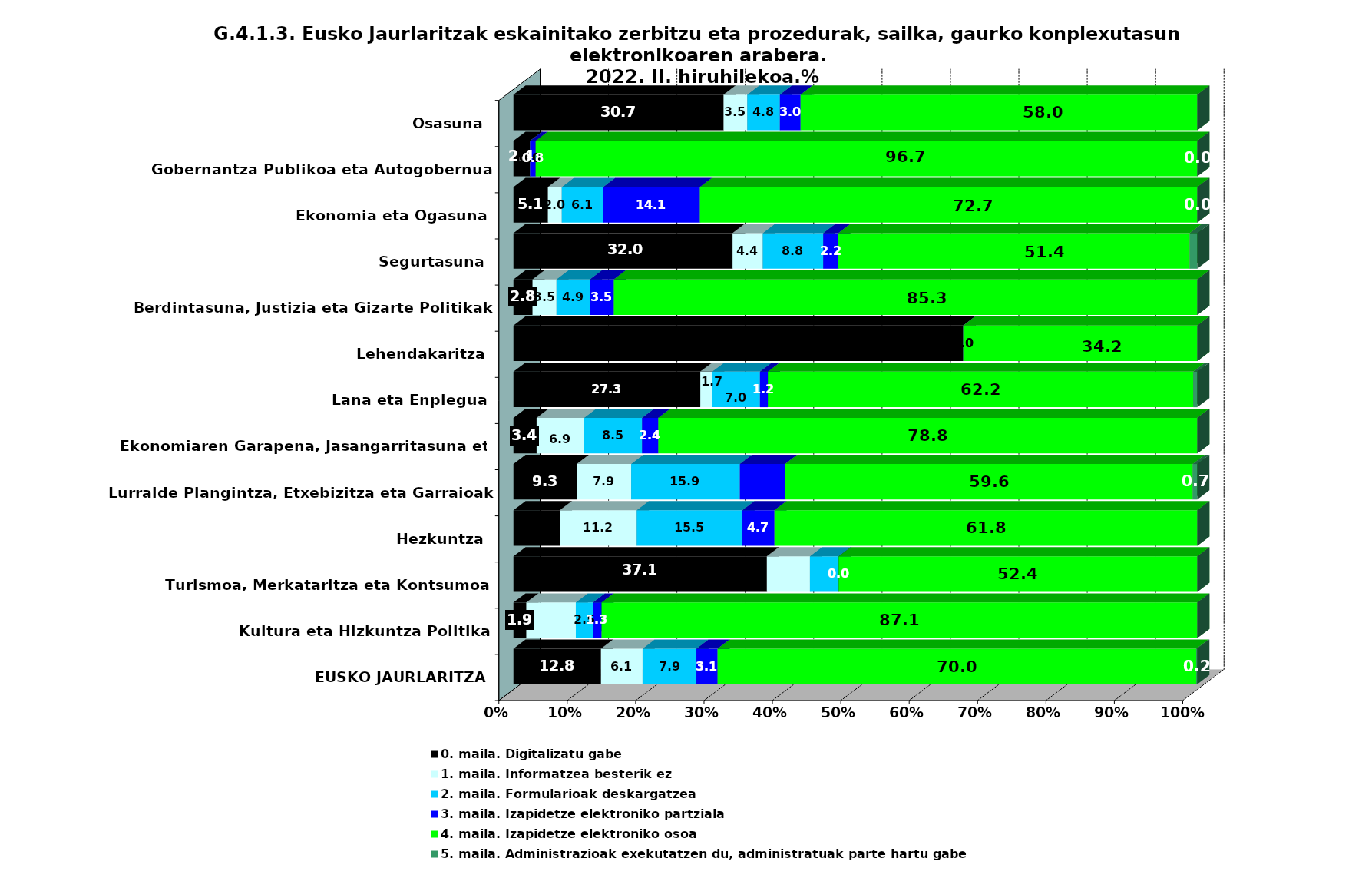
| Category | 0. maila. Digitalizatu gabe | 1. maila. Informatzea besterik ez | 2. maila. Formularioak deskargatzea | 3. maila. Izapidetze elektroniko partziala | 4. maila. Izapidetze elektroniko osoa | 5. maila. Administrazioak exekutatzen du, administratuak parte hartu gabe |
|---|---|---|---|---|---|---|
| EUSKO JAURLARITZA | 12.806 | 6.078 | 7.875 | 3.096 | 69.992 | 0.153 |
| Kultura eta Hizkuntza Politika | 1.887 | 7.233 | 2.516 | 1.258 | 87.107 | 0 |
| Turismoa, Merkataritza eta Kontsumoa | 37.063 | 6.294 | 4.196 | 0 | 52.448 | 0 |
| Hezkuntza | 6.792 | 11.241 | 15.457 | 4.684 | 61.827 | 0 |
| Lurralde Plangintza, Etxebizitza eta Garraioak | 9.272 | 7.947 | 15.894 | 6.623 | 59.603 | 0.662 |
| Ekonomiaren Garapena, Jasangarritasuna eta Ingurumena | 3.39 | 6.949 | 8.475 | 2.373 | 78.814 | 0 |
| Lana eta Enplegua | 27.326 | 1.744 | 6.977 | 1.163 | 62.209 | 0.581 |
| Lehendakaritza | 65.789 | 0 | 0 | 0 | 34.211 | 0 |
| Berdintasuna, Justizia eta Gizarte Politikak | 2.797 | 3.497 | 4.895 | 3.497 | 85.315 | 0 |
| Segurtasuna | 32.044 | 4.42 | 8.84 | 2.21 | 51.381 | 1.105 |
| Ekonomia eta Ogasuna | 5.051 | 2.02 | 6.061 | 14.141 | 72.727 | 0 |
| Gobernantza Publikoa eta Autogobernua | 2.439 | 0 | 0 | 0.813 | 96.748 | 0 |
| Osasuna | 30.736 | 3.463 | 4.762 | 3.03 | 58.009 | 0 |